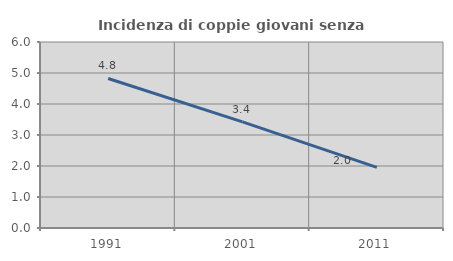
| Category | Incidenza di coppie giovani senza figli |
|---|---|
| 1991.0 | 4.823 |
| 2001.0 | 3.422 |
| 2011.0 | 1.958 |